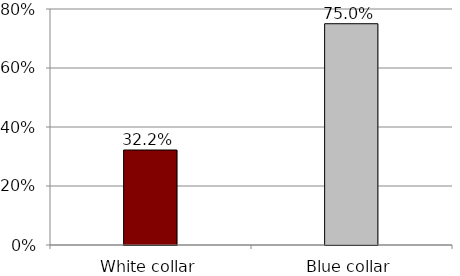
| Category | Series 0 |
|---|---|
| White collar | 0.322 |
| Blue collar | 0.75 |